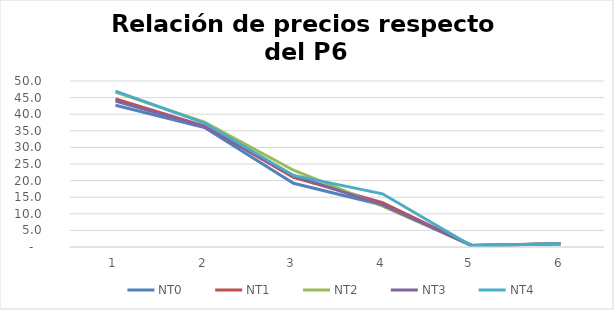
| Category | NT0 | NT1 | NT2 | NT3 | NT4 |
|---|---|---|---|---|---|
| 0 | 42.678 | 44.572 | 46.629 | 43.979 | 46.93 |
| 1 | 35.975 | 36.442 | 37.628 | 36.252 | 37.344 |
| 2 | 19.177 | 21.012 | 23.113 | 21.486 | 21.558 |
| 3 | 12.665 | 13.348 | 12.28 | 12.699 | 16.02 |
| 4 | 0.478 | 0.468 | 0.522 | 0.481 | 0.351 |
| 5 | 1 | 1 | 1 | 1 | 1 |